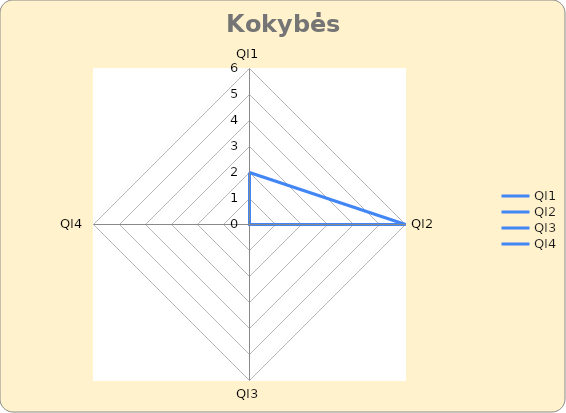
| Category | Series 0 |
|---|---|
| QI1 | 2 |
| QI2 | 6 |
| QI3 | 0 |
| QI4 | 0 |